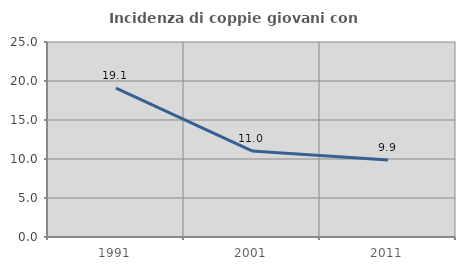
| Category | Incidenza di coppie giovani con figli |
|---|---|
| 1991.0 | 19.095 |
| 2001.0 | 11.031 |
| 2011.0 | 9.885 |